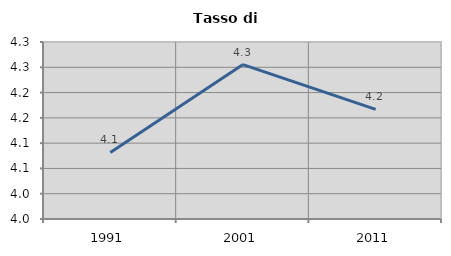
| Category | Tasso di disoccupazione   |
|---|---|
| 1991.0 | 4.082 |
| 2001.0 | 4.255 |
| 2011.0 | 4.167 |